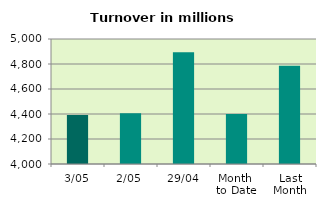
| Category | Series 0 |
|---|---|
| 3/05 | 4392.391 |
| 2/05 | 4406.705 |
| 29/04 | 4893.828 |
| Month 
to Date | 4399.548 |
| Last
Month | 4785.141 |